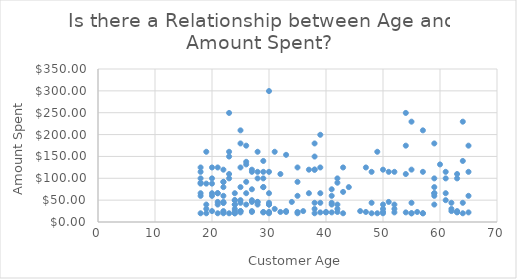
| Category | Amount Spent |
|---|---|
| 21.0 | 45.9 |
| 57.0 | 19.95 |
| 25.0 | 21.95 |
| 38.0 | 19.95 |
| 22.0 | 79.8 |
| 29.0 | 79.8 |
| 18.0 | 59.85 |
| 64.0 | 139.65 |
| 27.0 | 119.7 |
| 22.0 | 43.9 |
| 39.0 | 43.9 |
| 61.0 | 99.75 |
| 18.0 | 114.75 |
| 22.0 | 91.8 |
| 52.0 | 114.75 |
| 22.0 | 22.95 |
| 18.0 | 124.75 |
| 55.0 | 19.95 |
| 20.0 | 87.8 |
| 42.0 | 22.95 |
| 30.0 | 299.5 |
| 64.0 | 19.95 |
| 63.0 | 99.75 |
| 41.0 | 39.9 |
| 21.0 | 65.85 |
| 63.0 | 24.95 |
| 54.0 | 21.95 |
| 18.0 | 19.95 |
| 26.0 | 91.8 |
| 59.0 | 65.85 |
| 30.0 | 39.9 |
| 64.0 | 43.9 |
| 30.0 | 65.85 |
| 41.0 | 43.9 |
| 23.0 | 99.75 |
| 52.0 | 29.95 |
| 18.0 | 65.85 |
| 32.0 | 22.95 |
| 22.0 | 19.95 |
| 29.0 | 99.75 |
| 25.0 | 124.75 |
| 63.0 | 21.95 |
| 26.0 | 174.65 |
| 31.0 | 29.95 |
| 23.0 | 149.75 |
| 42.0 | 29.95 |
| 28.0 | 45.9 |
| 23.0 | 160.65 |
| 19.0 | 160.65 |
| 37.0 | 119.7 |
| 38.0 | 43.9 |
| 50.0 | 119.7 |
| 26.0 | 65.85 |
| 33.0 | 22.95 |
| 59.0 | 65.85 |
| 32.0 | 109.75 |
| 27.0 | 114.75 |
| 54.0 | 249.5 |
| 63.0 | 109.75 |
| 48.0 | 114.75 |
| 29.0 | 114.75 |
| 38.0 | 119.8 |
| 24.0 | 29.95 |
| 51.0 | 114.75 |
| 25.0 | 209.65 |
| 65.0 | 114.75 |
| 35.0 | 59.85 |
| 35.0 | 124.75 |
| 21.0 | 39.9 |
| 47.0 | 124.75 |
| 62.0 | 24.95 |
| 63.0 | 22.95 |
| 23.0 | 249.5 |
| 59.0 | 59.85 |
| 48.0 | 43.9 |
| 57.0 | 19.95 |
| 19.0 | 29.95 |
| 48.0 | 19.95 |
| 21.0 | 65.85 |
| 40.0 | 22.95 |
| 25.0 | 79.8 |
| 59.0 | 79.8 |
| 57.0 | 114.75 |
| 56.0 | 22.95 |
| 19.0 | 19.95 |
| 54.0 | 109.75 |
| 65.0 | 59.9 |
| 25.0 | 43.9 |
| 30.0 | 39.9 |
| 57.0 | 209.65 |
| 43.0 | 19.95 |
| 44.0 | 79.8 |
| 21.0 | 124.75 |
| 20.0 | 24.95 |
| 49.0 | 160.65 |
| 37.0 | 65.85 |
| 26.0 | 137.7 |
| 62.0 | 29.95 |
| 38.0 | 119.7 |
| 55.0 | 19.95 |
| 24.0 | 39.9 |
| 30.0 | 114.75 |
| 39.0 | 21.95 |
| 59.0 | 179.7 |
| 26.0 | 39.9 |
| 33.0 | 24.95 |
| 20.0 | 99.8 |
| 18.0 | 87.8 |
| 19.0 | 39.9 |
| 61.0 | 65.85 |
| 39.0 | 199.5 |
| 52.0 | 21.95 |
| 20.0 | 124.75 |
| 50.0 | 29.95 |
| 29.0 | 21.95 |
| 55.0 | 119.8 |
| 18.0 | 89.85 |
| 39.0 | 65.85 |
| 35.0 | 91.8 |
| 38.0 | 149.7 |
| 20.0 | 59.85 |
| 60.0 | 131.7 |
| 61.0 | 49.9 |
| 62.0 | 43.9 |
| 21.0 | 19.95 |
| 40.0 | 21.95 |
| 25.0 | 24.95 |
| 50.0 | 39.9 |
| 24.0 | 24.95 |
| 28.0 | 114.75 |
| 22.0 | 119.7 |
| 22.0 | 43.9 |
| 27.0 | 24.95 |
| 54.0 | 174.65 |
| 25.0 | 24.95 |
| 25.0 | 49.9 |
| 30.0 | 19.95 |
| 59.0 | 39.9 |
| 51.0 | 45.9 |
| 38.0 | 179.7 |
| 28.0 | 160.65 |
| 30.0 | 21.95 |
| 43.0 | 124.75 |
| 42.0 | 89.85 |
| 24.0 | 49.9 |
| 47.0 | 22.95 |
| 23.0 | 19.95 |
| 59.0 | 99.75 |
| 22.0 | 91.8 |
| 27.0 | 49.9 |
| 65.0 | 21.95 |
| 27.0 | 45.9 |
| 27.0 | 22.95 |
| 28.0 | 45.9 |
| 22.0 | 24.95 |
| 42.0 | 39.9 |
| 25.0 | 179.7 |
| 41.0 | 21.95 |
| 46.0 | 24.95 |
| 41.0 | 74.85 |
| 29.0 | 79.8 |
| 50.0 | 19.95 |
| 50.0 | 22.95 |
| 34.0 | 45.9 |
| 24.0 | 65.85 |
| 29.0 | 139.65 |
| 35.0 | 22.95 |
| 24.0 | 39.9 |
| 23.0 | 109.75 |
| 31.0 | 160.65 |
| 24.0 | 49.9 |
| 30.0 | 22.95 |
| 22.0 | 45.9 |
| 43.0 | 68.85 |
| 55.0 | 229.5 |
| 38.0 | 29.95 |
| 28.0 | 39.9 |
| 30.0 | 43.9 |
| 35.0 | 19.95 |
| 41.0 | 59.9 |
| 28.0 | 99.75 |
| 65.0 | 174.65 |
| 20.0 | 65.85 |
| 39.0 | 124.75 |
| 19.0 | 87.8 |
| 64.0 | 229.5 |
| 42.0 | 99.75 |
| 24.0 | 19.95 |
| 24.0 | 19.95 |
| 18.0 | 99.8 |
| 36.0 | 24.95 |
| 61.0 | 114.75 |
| 22.0 | 59.85 |
| 55.0 | 43.9 |
| 27.0 | 74.85 |
| 49.0 | 19.95 |
| 29.0 | 22.95 |
| 33.0 | 153.65 |
| 52.0 | 39.9 |
| 26.0 | 131.7 |